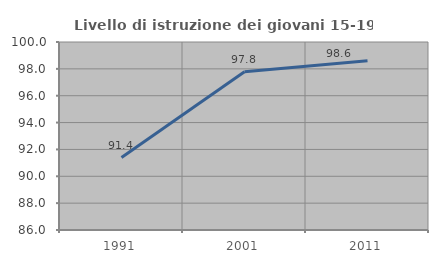
| Category | Livello di istruzione dei giovani 15-19 anni |
|---|---|
| 1991.0 | 91.398 |
| 2001.0 | 97.778 |
| 2011.0 | 98.611 |